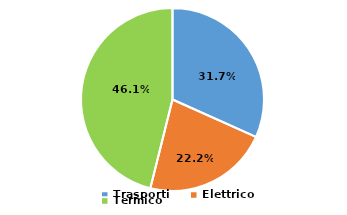
| Category | Series 0 |
|---|---|
| Trasporti | 31.702 |
| Elettrico | 22.19 |
| Termico | 46.108 |